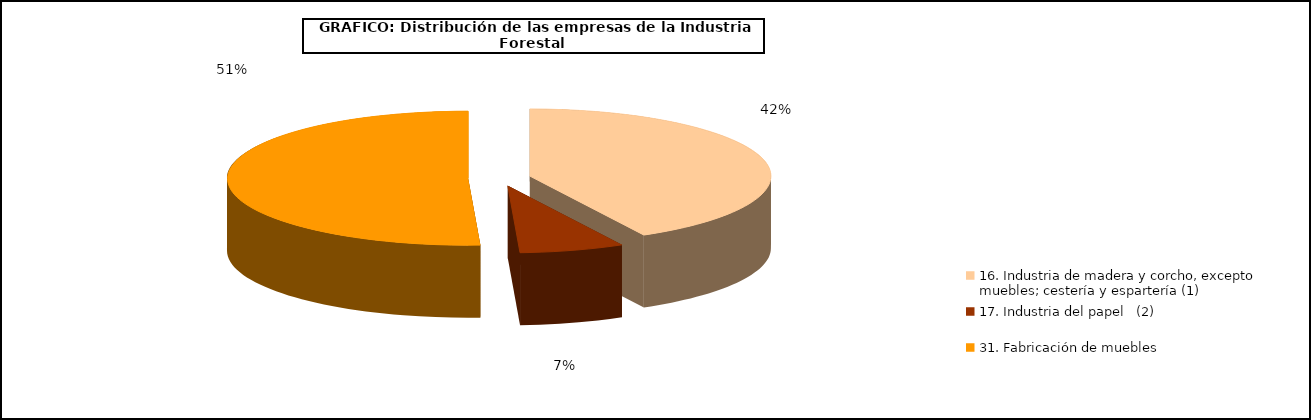
| Category | Series 0 |
|---|---|
| 16. Industria de madera y corcho, excepto  muebles; cestería y espartería (1) | 42.153 |
| 17. Industria del papel   (2) | 7.039 |
| 31. Fabricación de muebles  | 50.807 |